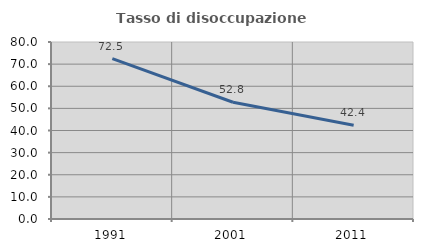
| Category | Tasso di disoccupazione giovanile  |
|---|---|
| 1991.0 | 72.47 |
| 2001.0 | 52.778 |
| 2011.0 | 42.373 |